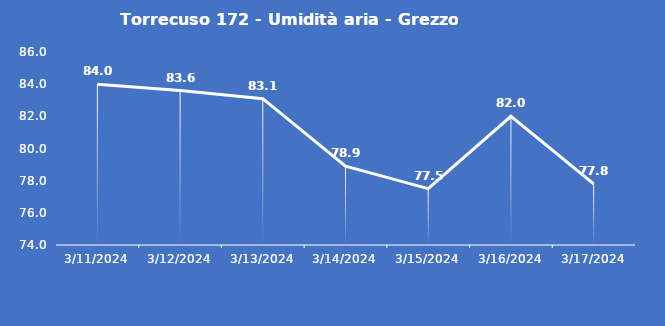
| Category | Torrecuso 172 - Umidità aria - Grezzo (%) |
|---|---|
| 3/11/24 | 84 |
| 3/12/24 | 83.6 |
| 3/13/24 | 83.1 |
| 3/14/24 | 78.9 |
| 3/15/24 | 77.5 |
| 3/16/24 | 82 |
| 3/17/24 | 77.8 |